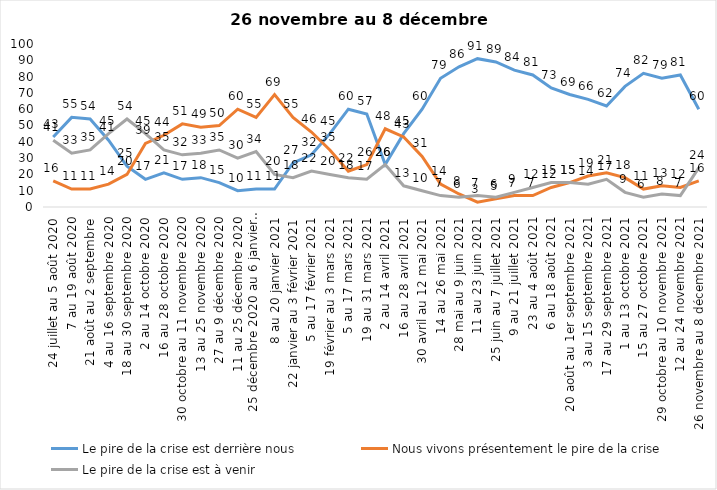
| Category | Le pire de la crise est derrière nous | Nous vivons présentement le pire de la crise | Le pire de la crise est à venir |
|---|---|---|---|
| 24 juillet au 5 août 2020 | 43 | 16 | 41 |
| 7 au 19 août 2020 | 55 | 11 | 33 |
| 21 août au 2 septembre | 54 | 11 | 35 |
| 4 au 16 septembre 2020 | 41 | 14 | 45 |
| 18 au 30 septembre 2020 | 25 | 20 | 54 |
| 2 au 14 octobre 2020 | 17 | 39 | 45 |
| 16 au 28 octobre 2020 | 21 | 44 | 35 |
| 30 octobre au 11 novembre 2020 | 17 | 51 | 32 |
| 13 au 25 novembre 2020 | 18 | 49 | 33 |
| 27 au 9 décembre 2020 | 15 | 50 | 35 |
| 11 au 25 décembre 2020 | 10 | 60 | 30 |
| 25 décembre 2020 au 6 janvier  2021 | 11 | 55 | 34 |
| 8 au 20 janvier 2021 | 11 | 69 | 20 |
| 22 janvier au 3 février 2021 | 27 | 55 | 18 |
| 5 au 17 février 2021 | 32 | 46 | 22 |
| 19 février au 3 mars 2021 | 45 | 35 | 20 |
| 5 au 17 mars 2021 | 60 | 22 | 18 |
| 19 au 31 mars 2021 | 57 | 26 | 17 |
| 2 au 14 avril 2021 | 26 | 48 | 26 |
| 16 au 28 avril 2021 | 45 | 43 | 13 |
| 30 avril au 12 mai 2021 | 60 | 31 | 10 |
| 14 au 26 mai 2021 | 79 | 14 | 7 |
| 28 mai au 9 juin 2021 | 86 | 8 | 6 |
| 11 au 23 juin 2021 | 91 | 3 | 7 |
| 25 juin au 7 juillet 2021 | 89 | 5 | 6 |
| 9 au 21 juillet 2021 | 84 | 7 | 9 |
| 23 au 4 août 2021 | 81 | 7 | 12 |
| 6 au 18 août 2021 | 73 | 12 | 15 |
| 20 août au 1er septembre 2021 | 69 | 15 | 15 |
| 3 au 15 septembre 2021 | 66 | 19 | 14 |
| 17 au 29 septembre 2021 | 62 | 21 | 17 |
| 1 au 13 octobre 2021 | 74 | 18 | 9 |
| 15 au 27 octobre 2021 | 82 | 11 | 6 |
| 29 octobre au 10 novembre 2021 | 79 | 13 | 8 |
| 12 au 24 novembre 2021 | 81 | 12 | 7 |
| 26 novembre au 8 décembre 2021 | 60 | 16 | 24 |